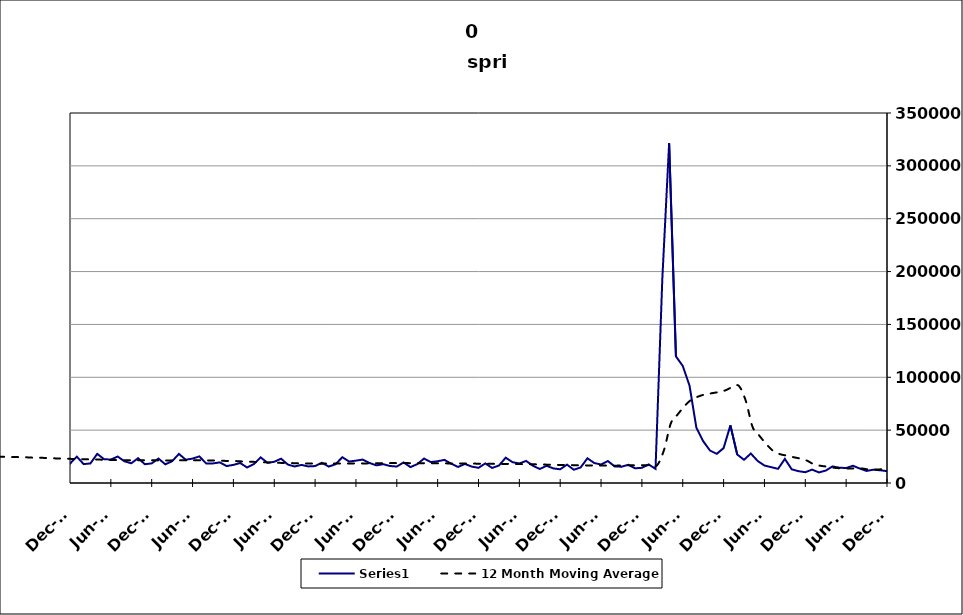
| Category | Series 0 |
|---|---|
| 2005-06-30 | 15559 |
| 2005-07-31 | 18863 |
| 2005-08-31 | 13688 |
| 2005-09-30 | 11216 |
| 2005-10-31 | 15195 |
| 2005-11-30 | 11106 |
| 2005-12-31 | 12178 |
| 2006-01-31 | 12307 |
| 2006-02-28 | 9756 |
| 2006-03-31 | 11166 |
| 2006-04-30 | 18194 |
| 2006-05-31 | 13863 |
| 2006-06-30 | 14337 |
| 2006-07-31 | 17845 |
| 2006-08-31 | 13259 |
| 2006-09-30 | 13170 |
| 2006-10-31 | 14318 |
| 2006-11-30 | 12528 |
| 2006-12-31 | 14662 |
| 2007-01-31 | 14365 |
| 2007-02-28 | 12004 |
| 2007-03-31 | 15715 |
| 2007-04-30 | 21487 |
| 2007-05-31 | 15927 |
| 2007-06-30 | 20117 |
| 2007-07-30 | 19634 |
| 2007-08-31 | 15908 |
| 2007-09-30 | 17289 |
| 2007-10-31 | 17016 |
| 2007-11-15 | 14868 |
| 2007-12-15 09:36:00 | 15051 |
| 2008-01-14 19:12:00 | 19519 |
| 2008-02-14 04:48:00 | 17071 |
| 2008-03-15 14:24:00 | 18041 |
| 2008-04-15 | 26337 |
| 2008-05-15 09:36:00 | 21529 |
| 2008-06-14 19:12:00 | 24509 |
| 2008-07-15 04:48:00 | 26739 |
| 2008-08-14 14:24:00 | 22508 |
| 2008-09-14 | 24197 |
| 2008-10-14 09:36:00 | 30666 |
| 2008-11-13 19:12:00 | 30363 |
| 2008-12-14 04:48:00 | 34409 |
| 2009-01-13 14:24:00 | 39076 |
| 2009-02-13 | 34958 |
| 2009-03-15 09:36:00 | 39174 |
| 2009-04-14 19:12:00 | 41068 |
| 2009-05-15 04:48:00 | 34839 |
| 2009-06-14 14:24:00 | 38758 |
| 2009-07-15 | 38827 |
| 2009-08-14 09:36:00 | 32747 |
| 2009-09-13 19:12:00 | 30654 |
| 2009-10-14 04:48:00 | 31279 |
| 2009-11-13 14:24:00 | 28764 |
| 2009-12-14 | 28567 |
| 2010-01-13 09:36:00 | 31536 |
| 2010-02-12 19:12:00 | 23411 |
| 2010-03-15 04:48:00 | 27064 |
| 2010-04-14 14:24:00 | 31806 |
| 2010-05-15 | 27535 |
| 2010-06-14 09:36:00 | 30999 |
| 2010-07-14 19:12:00 | 30859 |
| 2010-08-14 04:48:00 | 27473 |
| 2010-09-13 14:24:00 | 23569 |
| 2010-10-14 | 26397 |
| 2010-11-13 09:36:00 | 23332 |
| 2010-12-13 19:12:00 | 23208 |
| 2011-01-13 04:48:00 | 29123 |
| 2011-02-12 14:24:00 | 19880 |
| 2011-03-15 | 23037 |
| 2011-04-14 09:36:00 | 29838 |
| 2011-05-14 19:12:00 | 26805 |
| 2011-06-14 04:48:00 | 27951 |
| 2011-07-14 14:24:00 | 27959 |
| 2011-08-14 | 25368 |
| 2011-09-13 09:36:00 | 21516 |
| 2011-10-13 19:12:00 | 25249 |
| 2011-11-13 04:48:00 | 21348 |
| 2011-12-13 14:24:00 | 21373 |
| 2012-01-13 | 26870 |
| 2012-02-12 09:36:00 | 19799 |
| 2012-03-13 19:12:00 | 20523 |
| 2012-04-13 04:48:00 | 29208 |
| 2012-05-13 14:24:00 | 25322 |
| 2012-06-13 | 23562 |
| 2012-07-13 09:36:00 | 27564 |
| 2012-08-12 19:12:00 | 21787 |
| 2012-09-12 04:48:00 | 18024 |
| 2012-10-12 14:24:00 | 22967 |
| 2012-11-12 | 19147 |
| 2012-12-12 09:36:00 | 18332 |
| 2013-01-11 19:12:00 | 24929 |
| 2013-02-11 04:48:00 | 17864 |
| 2013-03-13 14:24:00 | 18518 |
| 2013-04-13 | 27564 |
| 2013-05-13 09:36:00 | 22544 |
| 2013-06-12 19:12:00 | 22178 |
| 2013-07-13 04:48:00 | 25052 |
| 2013-08-12 14:24:00 | 20510 |
| 2013-09-12 | 18652 |
| 2013-10-12 09:36:00 | 23457 |
| 2013-11-11 19:12:00 | 17762 |
| 2013-12-12 04:48:00 | 18554 |
| 2014-01-11 14:24:00 | 23110 |
| 2014-02-11 | 17656 |
| 2014-03-13 09:36:00 | 20574 |
| 2014-04-12 19:12:00 | 27528 |
| 2014-05-13 04:48:00 | 22003 |
| 2014-06-12 14:24:00 | 23093 |
| 2014-07-13 | 25159 |
| 2014-08-12 09:36:00 | 18501 |
| 2014-09-11 19:12:00 | 18519 |
| 2014-10-12 04:48:00 | 19501 |
| 2014-11-11 14:24:00 | 16036 |
| 2014-12-12 | 17142 |
| 2015-01-11 09:36:00 | 18920 |
| 2015-02-10 19:12:00 | 14673 |
| 2015-03-13 04:48:00 | 17842 |
| 2015-04-12 14:24:00 | 24284 |
| 2015-05-13 | 19120 |
| 2015-06-12 09:36:00 | 20073 |
| 2015-07-12 19:12:00 | 23007 |
| 2015-08-12 04:48:00 | 17420 |
| 2015-09-11 14:24:00 | 15620 |
| 2015-10-12 | 17117 |
| 2015-11-11 09:36:00 | 15685 |
| 2015-12-11 19:12:00 | 16020 |
| 2016-01-11 04:48:00 | 19143 |
| 2016-02-10 14:24:00 | 15551 |
| 2016-03-12 | 17721 |
| 2016-04-11 09:36:00 | 24381 |
| 2016-05-11 19:12:00 | 20319 |
| 2016-06-11 04:48:00 | 21157 |
| 2016-07-11 14:24:00 | 22155 |
| 2016-08-11 | 18945 |
| 2016-09-10 09:36:00 | 16699 |
| 2016-10-10 19:12:00 | 17773 |
| 2016-11-10 04:48:00 | 16104 |
| 2016-12-10 14:24:00 | 15555 |
| 2017-01-10 | 19468 |
| 2017-02-09 09:36:00 | 15031 |
| 2017-03-11 19:12:00 | 17840 |
| 2017-04-11 04:48:00 | 23124 |
| 2017-05-11 14:24:00 | 19802 |
| 2017-06-11 | 20588 |
| 2017-07-11 09:36:00 | 21858 |
| 2017-08-10 19:12:00 | 18231 |
| 2017-09-10 04:48:00 | 15171 |
| 2017-10-10 14:24:00 | 18027 |
| 2017-11-10 | 15538 |
| 2017-12-10 09:36:00 | 14339 |
| 2018-01-09 19:12:00 | 18538 |
| 2018-02-09 04:48:00 | 14230 |
| 2018-03-11 14:24:00 | 16525 |
| 2018-04-11 | 23962 |
| 2018-05-11 09:36:00 | 19679 |
| 2018-06-10 19:12:00 | 18492 |
| 2018-07-11 04:48:00 | 20879 |
| 2018-08-10 14:24:00 | 16306 |
| 2018-09-10 | 13227 |
| 2018-10-10 09:36:00 | 16273 |
| 2018-11-09 19:12:00 | 13796 |
| 2018-12-10 04:48:00 | 12964 |
| 2019-01-09 14:24:00 | 17391 |
| 2019-02-09 | 12534 |
| 2019-03-11 09:36:00 | 14705 |
| 2019-04-10 19:12:00 | 23399 |
| 2019-05-11 04:48:00 | 18895 |
| 2019-06-10 14:24:00 | 17486 |
| 2019-07-11 | 20792 |
| 2019-08-10 09:36:00 | 15676 |
| 2019-09-09 19:12:00 | 15415 |
| 2019-10-10 04:48:00 | 17202 |
| 2019-11-09 14:24:00 | 13905 |
| 2019-12-10 | 14356 |
| 2020-01-09 09:36:00 | 17551 |
| 2020-02-08 19:12:00 | 13374 |
| 2020-03-10 04:48:00 | 193236 |
| 2020-04-09 14:24:00 | 321397 |
| 2020-05-10 | 119809 |
| 2020-06-09 09:36:00 | 110709 |
| 2020-07-09 19:12:00 | 91992 |
| 2020-08-09 04:48:00 | 52303 |
| 2020-09-08 14:24:00 | 39616 |
| 2020-10-09 | 30687 |
| 2020-11-08 09:36:00 | 27606 |
| 2020-12-08 19:12:00 | 32990 |
| 2021-01-08 04:48:00 | 54483 |
| 2021-02-07 14:24:00 | 26952 |
| 2021-03-10 | 21951 |
| 2021-04-09 09:36:00 | 27881 |
| 2021-05-09 19:12:00 | 20877 |
| 2021-06-09 04:48:00 | 16503 |
| 2021-07-09 14:24:00 | 14975 |
| 2021-08-09 | 13409 |
| 2021-09-08 09:36:00 | 22784 |
| 2021-10-08 19:12:00 | 12970 |
| 2021-11-08 04:48:00 | 11178 |
| 2021-12-08 14:24:00 | 10213 |
| 2022-01-08 | 12675 |
| 2022-02-07 09:36:00 | 10001 |
| 2022-03-09 19:12:00 | 11739 |
| 2022-04-09 04:48:00 | 15679 |
| 2022-05-09 14:24:00 | 14464 |
| 2022-06-09 | 14143 |
| 2022-07-09 09:36:00 | 16322 |
| 2022-08-08 19:12:00 | 13673 |
| 2022-09-08 04:48:00 | 11418 |
| 2022-10-08 14:24:00 | 12593 |
| 2022-11-08 | 12027 |
| 2022-12-08 09:36:00 | 11247 |